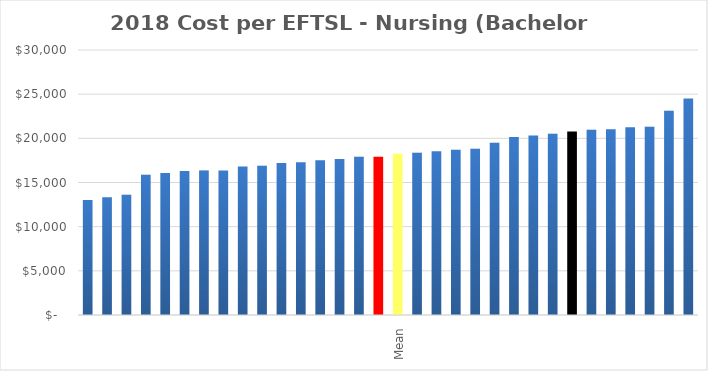
| Category | Series 0 |
|---|---|
|  | 13008.149 |
|  | 13321.062 |
|  | 13623.97 |
|  | 15873.024 |
|  | 16081.307 |
|  | 16293.66 |
|  | 16349.191 |
|  | 16370.219 |
|  | 16812.06 |
|  | 16883.393 |
|  | 17200.276 |
|  | 17297.333 |
|  | 17530.148 |
|  | 17657.303 |
|  | 17905.757 |
| Median | 17905.757 |
| Mean | 18252.777 |
|  | 18354.952 |
|  | 18537.644 |
|  | 18710.797 |
|  | 18811.142 |
|  | 19498.63 |
|  | 20140.232 |
|  | 20331.601 |
|  | 20521.694 |
| 2018 Base Funding per EFTSL | 20768 |